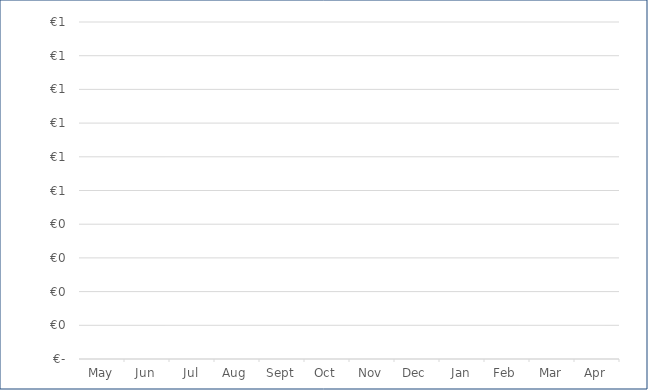
| Category | Niet onder minimum | Onder minimum |
|---|---|---|
| 2021-05-01 | 0 | 0 |
| 2021-06-01 | 0 | 0 |
| 2021-07-01 | 0 | 0 |
| 2021-08-01 | 0 | 0 |
| 2021-09-01 | 0 | 0 |
| 2021-10-01 | 0 | 0 |
| 2021-11-01 | 0 | 0 |
| 2021-12-01 | 0 | 0 |
| 2022-01-01 | 0 | 0 |
| 2022-02-01 | 0 | 0 |
| 2022-03-01 | 0 | 0 |
| 2022-04-01 | 0 | 0 |